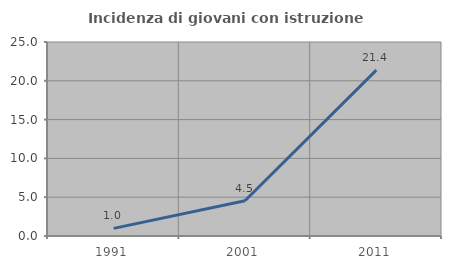
| Category | Incidenza di giovani con istruzione universitaria |
|---|---|
| 1991.0 | 0.98 |
| 2001.0 | 4.545 |
| 2011.0 | 21.368 |